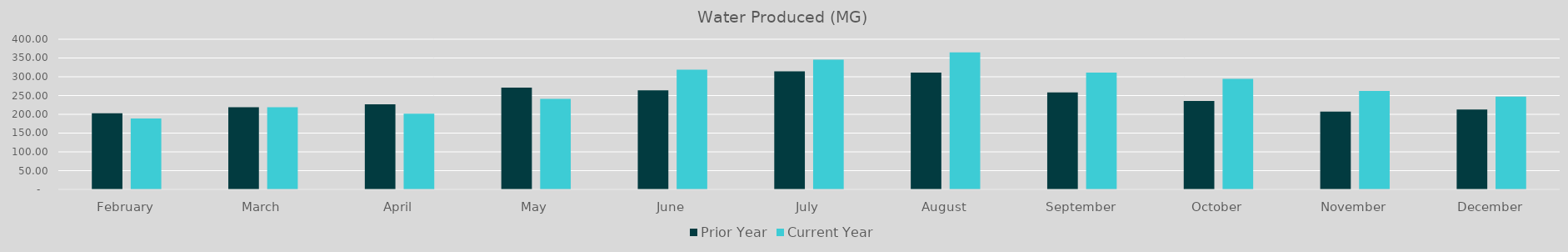
| Category | Prior Year | Current Year |
|---|---|---|
| February | 202.92 | 189.14 |
| March | 218.89 | 218.9 |
| April | 226.62 | 201.4 |
| May | 270.85 | 241.3 |
| June | 263.67 | 318.9 |
| July | 314.55 | 345.4 |
| August | 311.17 | 364.8 |
| September | 258.3 | 311 |
| October | 235.52 | 294.3 |
| November | 207.02 | 262.21 |
| December | 212.652 | 246.95 |